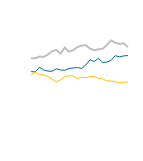
| Category | Online | Store | Phone |
|---|---|---|---|
| 0 | 5818 | 7052 | 5487 |
| 1 | 5786 | 7044 | 5772 |
| 2 | 6213 | 7203 | 5545 |
| 3 | 5966 | 7165 | 5508 |
| 4 | 5861 | 7388 | 5374 |
| 5 | 5854 | 7688 | 5107 |
| 6 | 6074 | 7809 | 4869 |
| 7 | 5958 | 7472 | 5063 |
| 8 | 5940 | 8017 | 5341 |
| 9 | 6098 | 7652 | 5441 |
| 10 | 6152 | 7787 | 5410 |
| 11 | 6188 | 8065 | 5179 |
| 12 | 6106 | 8205 | 5290 |
| 13 | 6424 | 8244 | 5255 |
| 14 | 6902 | 7923 | 5353 |
| 15 | 6742 | 7776 | 5383 |
| 16 | 7041 | 7866 | 5190 |
| 17 | 6658 | 7909 | 5142 |
| 18 | 6689 | 8257 | 4969 |
| 19 | 6851 | 8680 | 4954 |
| 20 | 7275 | 8470 | 4904 |
| 21 | 7173 | 8361 | 4779 |
| 22 | 7257 | 8412 | 4841 |
| 23 | 7289 | 8065 | 4864 |